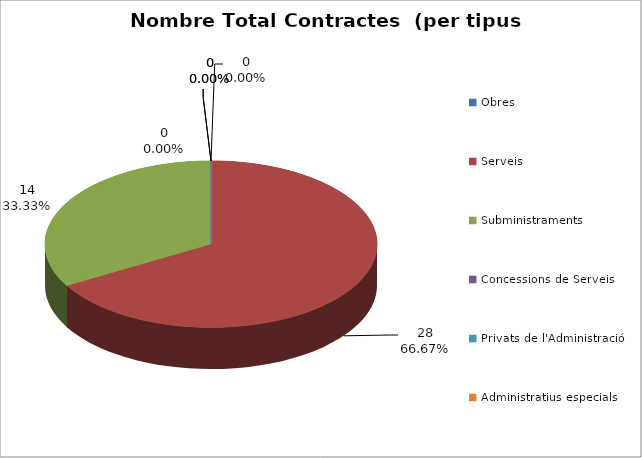
| Category | Nombre Total Contractes |
|---|---|
| Obres | 0 |
| Serveis | 28 |
| Subministraments | 14 |
| Concessions de Serveis | 0 |
| Privats de l'Administració | 0 |
| Administratius especials | 0 |